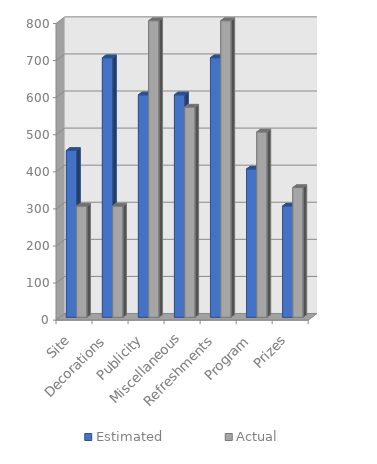
| Category | Estimated | Actual |
|---|---|---|
| Site | 450 | 300 |
| Decorations | 700 | 300 |
| Publicity | 600 | 800 |
| Miscellaneous | 600 | 567 |
| Refreshments | 700 | 800 |
| Program | 400 | 500 |
| Prizes | 300 | 350 |